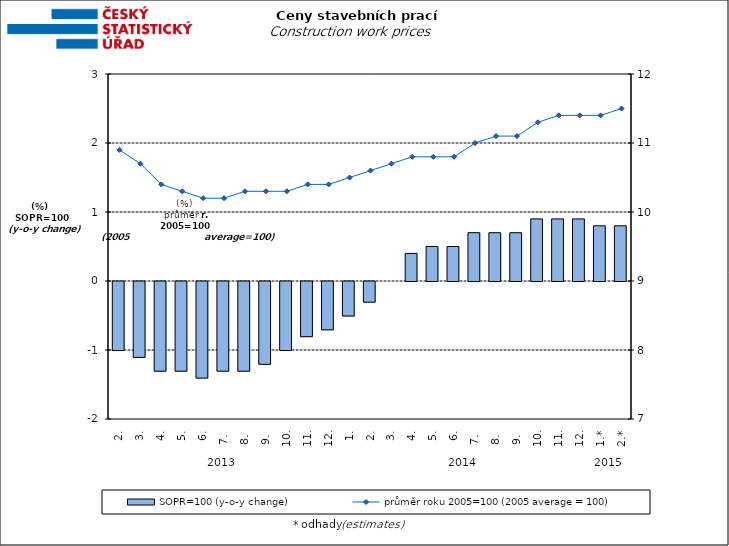
| Category | SOPR=100 (y-o-y change)   |
|---|---|
| 0 | -1 |
| 1 | -1.1 |
| 2 | -1.3 |
| 3 | -1.3 |
| 4 | -1.4 |
| 5 | -1.3 |
| 6 | -1.3 |
| 7 | -1.2 |
| 8 | -1 |
| 9 | -0.8 |
| 10 | -0.7 |
| 11 | -0.5 |
| 12 | -0.3 |
| 13 | 0 |
| 14 | 0.4 |
| 15 | 0.5 |
| 16 | 0.5 |
| 17 | 0.7 |
| 18 | 0.7 |
| 19 | 0.7 |
| 20 | 0.9 |
| 21 | 0.9 |
| 22 | 0.9 |
| 23 | 0.8 |
| 24 | 0.8 |